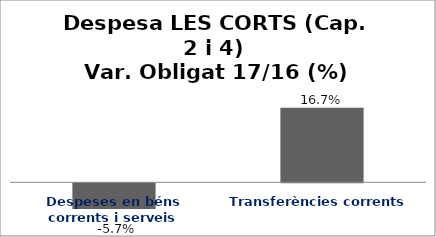
| Category | Series 0 |
|---|---|
| Despeses en béns corrents i serveis | -0.057 |
| Transferències corrents | 0.167 |